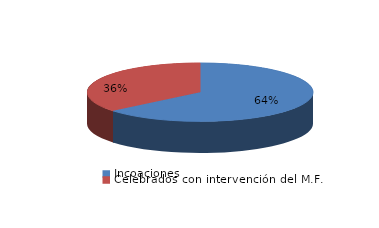
| Category | Series 0 |
|---|---|
| Incoaciones | 36114 |
| Celebrados con intervención del M.F. | 20331 |